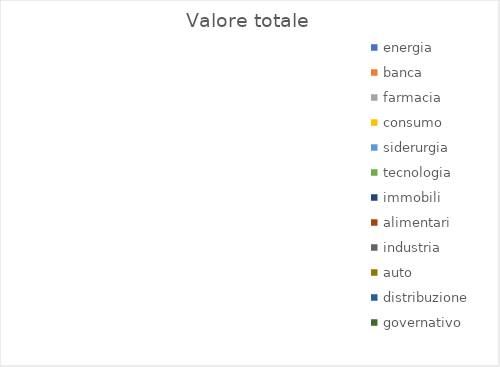
| Category | Valore totale |
|---|---|
| energia | 0 |
| banca | 0 |
| farmacia | 0 |
| consumo | 0 |
| siderurgia | 0 |
| tecnologia | 0 |
| immobili | 0 |
| alimentari | 0 |
| industria | 0 |
| auto | 0 |
| distribuzione | 0 |
| governativo | 0 |